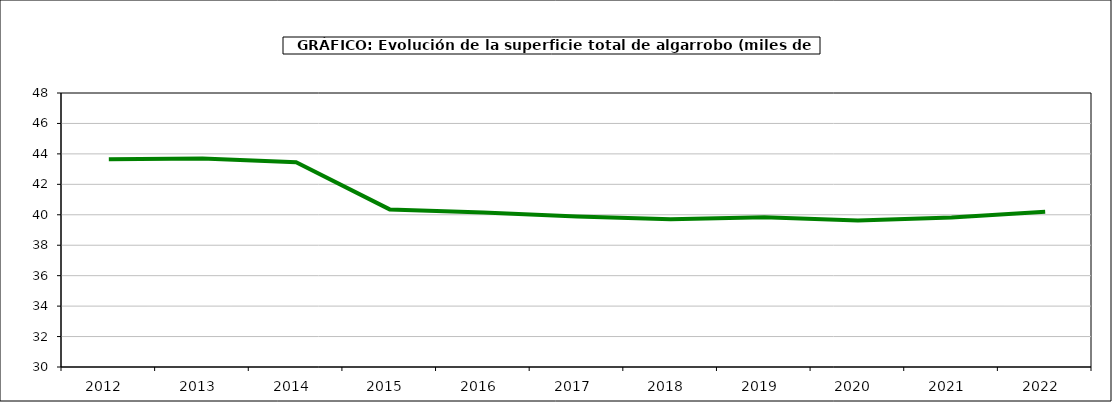
| Category | superficie |
|---|---|
| 2012.0 | 43.647 |
| 2013.0 | 43.695 |
| 2014.0 | 43.447 |
| 2015.0 | 40.353 |
| 2016.0 | 40.144 |
| 2017.0 | 39.889 |
| 2018.0 | 39.705 |
| 2019.0 | 39.835 |
| 2020.0 | 39.626 |
| 2021.0 | 39.825 |
| 2022.0 | 40.198 |